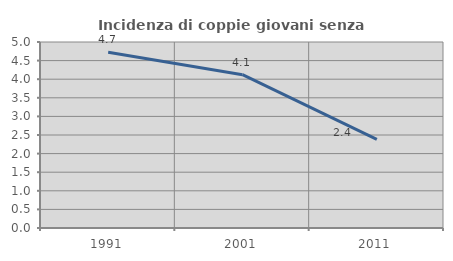
| Category | Incidenza di coppie giovani senza figli |
|---|---|
| 1991.0 | 4.724 |
| 2001.0 | 4.12 |
| 2011.0 | 2.381 |